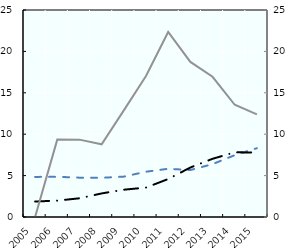
| Category |   Financial social assistance recipients |   Recipients of ZPIZ partial disability benefit |
|---|---|---|
| 2005.0 | 4.843 | 1.871 |
| 2006.0 | 4.856 | 1.978 |
| 2007.0 | 4.751 | 2.26 |
| 2008.0 | 4.733 | 2.846 |
| 2009.0 | 4.877 | 3.295 |
| 2010.0 | 5.469 | 3.554 |
| 2011.0 | 5.824 | 4.587 |
| 2012.0 | 5.672 | 5.977 |
| 2013.0 | 6.385 | 7.029 |
| 2014.0 | 7.468 | 7.81 |
| 2015.0 | 8.309 | 7.796 |